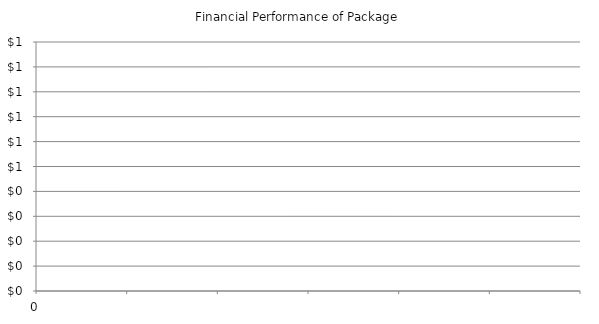
| Category | Payback |
|---|---|
| 0 | 0 |